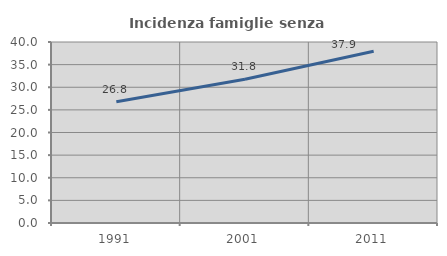
| Category | Incidenza famiglie senza nuclei |
|---|---|
| 1991.0 | 26.807 |
| 2001.0 | 31.763 |
| 2011.0 | 37.942 |